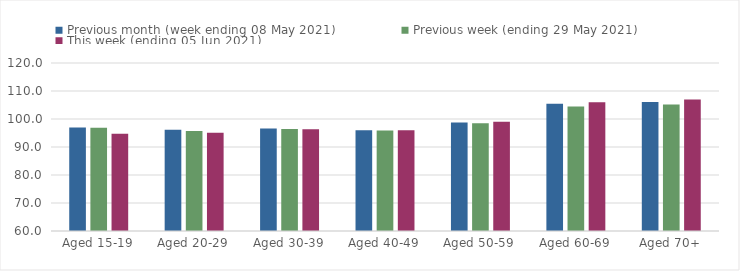
| Category | Previous month (week ending 08 May 2021) | Previous week (ending 29 May 2021) | This week (ending 05 Jun 2021) |
|---|---|---|---|
| Aged 15-19 | 96.98 | 96.87 | 94.69 |
| Aged 20-29 | 96.14 | 95.73 | 95.1 |
| Aged 30-39 | 96.64 | 96.43 | 96.31 |
| Aged 40-49 | 95.94 | 95.87 | 95.97 |
| Aged 50-59 | 98.78 | 98.5 | 99.05 |
| Aged 60-69 | 105.45 | 104.46 | 105.95 |
| Aged 70+ | 106.08 | 105.19 | 106.97 |